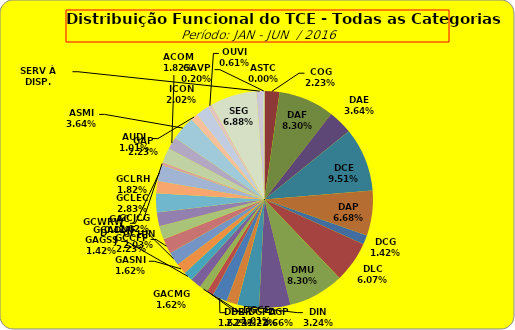
| Category | ASTC |
|---|---|
| ASTC | 0 |
| COG | 11 |
| DAF | 41 |
| DAE | 18 |
| DCE | 47 |
| DAP | 33 |
| DCG | 7 |
| DLC | 30 |
| DMU | 41 |
| DGP | 23 |
| DIN | 16 |
| DPE | 8 |
| DRR | 11 |
| DGCE | 5 |
| DGPA | 6 |
| GACMG | 8 |
| GAGSS | 7 |
| GASNI | 8 |
| GCADMFJ | 10 |
| GCCFF | 11 |
| GCHJN | 10 |
| GCJCG | 10 |
| GCLEC | 14 |
| GCLRH | 9 |
| GCWRWD | 12 |
| GAC | 2 |
| GAP | 11 |
| ACOM | 9 |
| ASMI | 18 |
| AUDI | 5 |
| ICON | 10 |
| OUVI | 3 |
| SEG | 34 |
| SERV À DISP. | 5 |
| GAVP | 1 |